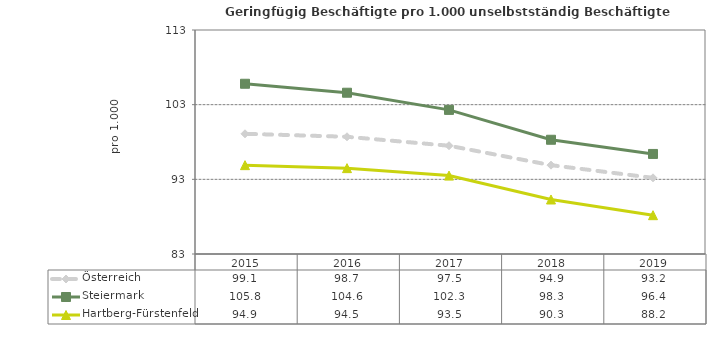
| Category | Österreich | Steiermark | Hartberg-Fürstenfeld |
|---|---|---|---|
| 2019.0 | 93.2 | 96.4 | 88.2 |
| 2018.0 | 94.9 | 98.3 | 90.3 |
| 2017.0 | 97.5 | 102.3 | 93.5 |
| 2016.0 | 98.7 | 104.6 | 94.5 |
| 2015.0 | 99.1 | 105.8 | 94.9 |